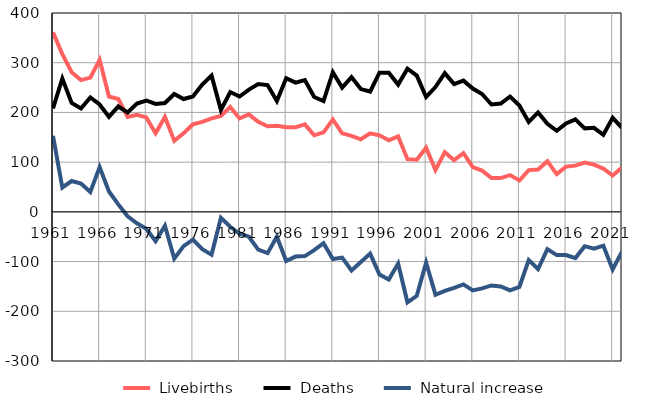
| Category |  Livebirths |  Deaths |  Natural increase |
|---|---|---|---|
| 1961.0 | 361 | 208 | 153 |
| 1962.0 | 317 | 268 | 49 |
| 1963.0 | 281 | 219 | 62 |
| 1964.0 | 265 | 208 | 57 |
| 1965.0 | 270 | 230 | 40 |
| 1966.0 | 306 | 216 | 90 |
| 1967.0 | 232 | 191 | 41 |
| 1968.0 | 227 | 212 | 15 |
| 1969.0 | 191 | 200 | -9 |
| 1970.0 | 195 | 218 | -23 |
| 1971.0 | 190 | 224 | -34 |
| 1972.0 | 158 | 217 | -59 |
| 1973.0 | 191 | 219 | -28 |
| 1974.0 | 143 | 237 | -94 |
| 1975.0 | 158 | 227 | -69 |
| 1976.0 | 176 | 232 | -56 |
| 1977.0 | 181 | 256 | -75 |
| 1978.0 | 188 | 274 | -86 |
| 1979.0 | 193 | 205 | -12 |
| 1980.0 | 211 | 241 | -30 |
| 1981.0 | 188 | 232 | -44 |
| 1982.0 | 196 | 246 | -50 |
| 1983.0 | 181 | 257 | -76 |
| 1984.0 | 172 | 255 | -83 |
| 1985.0 | 173 | 223 | -50 |
| 1986.0 | 170 | 269 | -99 |
| 1987.0 | 170 | 260 | -90 |
| 1988.0 | 176 | 265 | -89 |
| 1989.0 | 154 | 231 | -77 |
| 1990.0 | 160 | 223 | -63 |
| 1991.0 | 186 | 281 | -95 |
| 1992.0 | 158 | 250 | -92 |
| 1993.0 | 153 | 271 | -118 |
| 1994.0 | 146 | 247 | -101 |
| 1995.0 | 158 | 242 | -84 |
| 1996.0 | 154 | 280 | -126 |
| 1997.0 | 144 | 280 | -136 |
| 1998.0 | 152 | 256 | -104 |
| 1999.0 | 106 | 288 | -182 |
| 2000.0 | 105 | 274 | -169 |
| 2001.0 | 129 | 231 | -102 |
| 2002.0 | 84 | 251 | -167 |
| 2003.0 | 120 | 279 | -159 |
| 2004.0 | 104 | 257 | -153 |
| 2005.0 | 118 | 264 | -146 |
| 2006.0 | 90 | 248 | -158 |
| 2007.0 | 83 | 237 | -154 |
| 2008.0 | 68 | 216 | -148 |
| 2009.0 | 68 | 218 | -150 |
| 2010.0 | 74 | 232 | -158 |
| 2011.0 | 63 | 214 | -151 |
| 2012.0 | 84 | 181 | -97 |
| 2013.0 | 85 | 200 | -115 |
| 2014.0 | 102 | 177 | -75 |
| 2015.0 | 76 | 163 | -87 |
| 2016.0 | 91 | 178 | -87 |
| 2017.0 | 93 | 186 | -93 |
| 2018.0 | 99 | 168 | -69 |
| 2019.0 | 95 | 169 | -74 |
| 2020.0 | 87 | 155 | -68 |
| 2021.0 | 73 | 189 | -116 |
| 2022.0 | 89 | 169 | -80 |